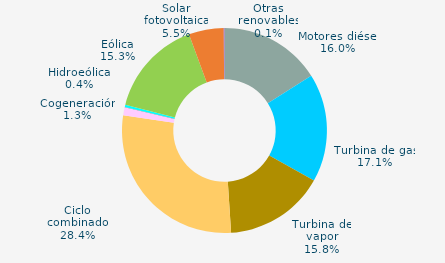
| Category | Series 0 |
|---|---|
| Motores diésel | 16.037 |
| Turbina de gas | 17.094 |
| Turbina de vapor | 15.843 |
| Ciclo combinado | 28.407 |
| Cogeneración | 1.254 |
| Hidráulica | 0.05 |
| Hidroeólica | 0.372 |
| Eólica | 15.307 |
| Solar fotovoltaica | 5.515 |
| Otras renovables | 0.121 |